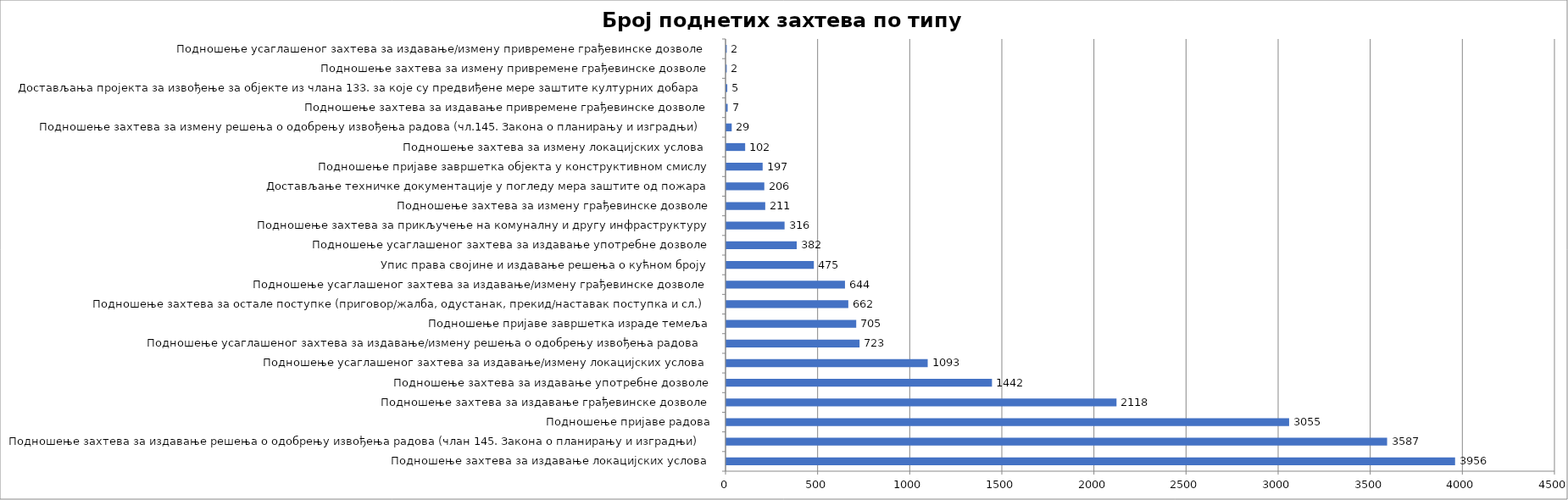
| Category | Број поднетих пријава |
|---|---|
| Подношење захтева за издавање локацијских услова | 3956 |
| Подношење захтева за издавање решења о одобрењу извођења радова (члан 145. Закона о планирању и изградњи) | 3587 |
| Подношење пријаве радова | 3055 |
| Подношење захтева за издавање грађевинске дозволе | 2118 |
| Подношење захтева за издавање употребне дозволе | 1442 |
| Подношење усаглашеног захтева за издавање/измену локацијских услова | 1093 |
| Подношење усаглашеног захтева за издавање/измену решења о одобрењу извођења радова  | 723 |
| Подношење пријаве завршетка израде темеља | 705 |
| Подношење захтева за остале поступке (приговор/жалба, одустанак, прекид/наставак поступка и сл.) | 662 |
| Подношење усаглашеног захтева за издавање/измену грађевинске дозволе | 644 |
| Упис права својине и издавање решења о кућном броју | 475 |
| Подношење усаглашеног захтева за издавање употребне дозволе | 382 |
| Подношење захтева за прикључење на комуналну и другу инфраструктуру | 316 |
| Подношење захтева за измену грађевинске дозволе | 211 |
| Достављање техничке документације у погледу мера заштите од пожара | 206 |
| Подношење пријаве завршетка објекта у конструктивном смислу | 197 |
| Подношење захтева за измену локацијских услова  | 102 |
| Подношење захтева за измену решења о одобрењу извођења радова (чл.145. Закона о планирању и изградњи) | 29 |
| Подношење захтева за издавање привремене грађевинске дозволе | 7 |
| Достављања пројекта за извођење за објекте из члана 133. за које су предвиђене мере заштите културних добара | 5 |
| Подношење захтева за измену привремене грађевинске дозволе | 2 |
| Подношење усаглашеног захтева за издавање/измену привремене грађевинске дозволе | 2 |